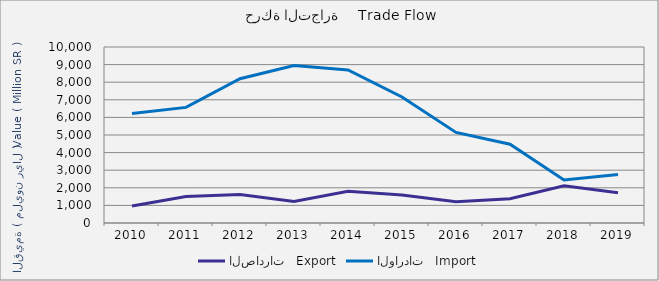
| Category | الصادرات   Export | الواردات   Import |
|---|---|---|
| 2010.0 | 969893715 | 6215643520 |
| 2011.0 | 1509944865 | 6567281579 |
| 2012.0 | 1615620568 | 8198654597 |
| 2013.0 | 1227110284 | 8952255912 |
| 2014.0 | 1804432803 | 8694140592 |
| 2015.0 | 1595231805 | 7158951645 |
| 2016.0 | 1201677739 | 5144170015 |
| 2017.0 | 1383757715 | 4473881423 |
| 2018.0 | 2111787866 | 2450119436 |
| 2019.0 | 1723500050 | 2750278552 |